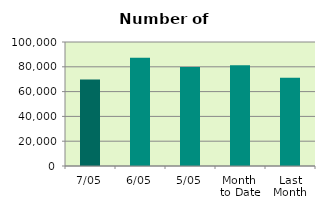
| Category | Series 0 |
|---|---|
| 7/05 | 69704 |
| 6/05 | 87278 |
| 5/05 | 79744 |
| Month 
to Date | 81264.5 |
| Last
Month | 71251.4 |